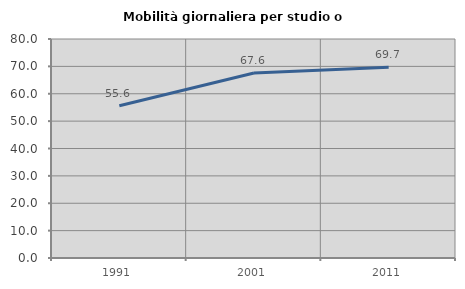
| Category | Mobilità giornaliera per studio o lavoro |
|---|---|
| 1991.0 | 55.646 |
| 2001.0 | 67.582 |
| 2011.0 | 69.712 |